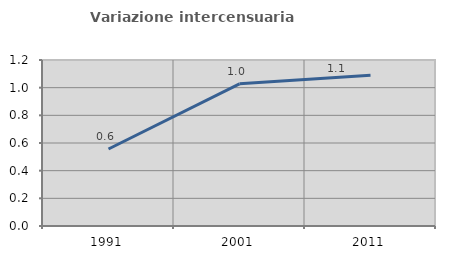
| Category | Variazione intercensuaria annua |
|---|---|
| 1991.0 | 0.557 |
| 2001.0 | 1.028 |
| 2011.0 | 1.089 |